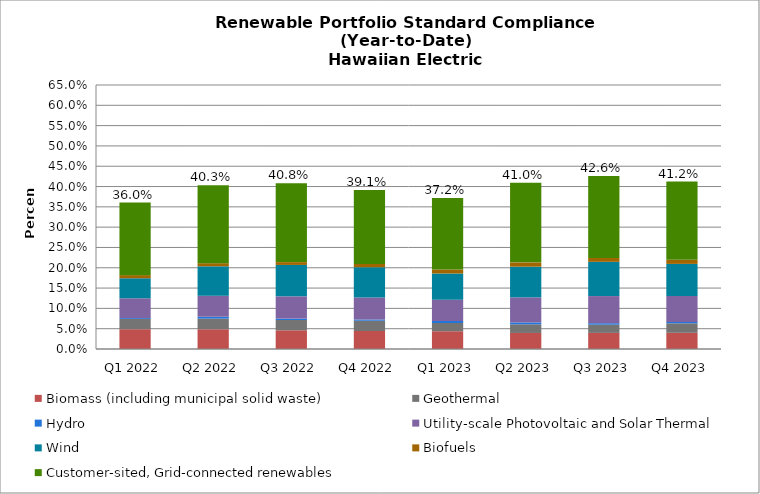
| Category | Biomass (including municipal solid waste) | Geothermal | Hydro | Utility-scale Photovoltaic and Solar Thermal | Wind | Biofuels | Customer-sited, Grid-connected renewables | Hawaiian Electric |
|---|---|---|---|---|---|---|---|---|
| Q1 2022 | 0.049 | 0.025 | 0.002 | 0.049 | 0.049 | 0.008 | 0.179 | 0.36 |
| Q2 2022 | 0.049 | 0.026 | 0.005 | 0.052 | 0.073 | 0.008 | 0.192 | 0.403 |
| Q3 2022 | 0.046 | 0.025 | 0.003 | 0.055 | 0.077 | 0.007 | 0.194 | 0.408 |
| Q4 2022 | 0.044 | 0.025 | 0.003 | 0.054 | 0.075 | 0.008 | 0.182 | 0.391 |
| Q1 2023 | 0.044 | 0.021 | 0.005 | 0.052 | 0.065 | 0.01 | 0.176 | 0.372 |
| Q2 2023 | 0.039 | 0.021 | 0.005 | 0.062 | 0.076 | 0.011 | 0.196 | 0.41 |
| Q3 2023 | 0.04 | 0.02 | 0.004 | 0.067 | 0.084 | 0.01 | 0.202 | 0.426 |
| Q4 2023 | 0.04 | 0.023 | 0.003 | 0.064 | 0.079 | 0.01 | 0.193 | 0.412 |